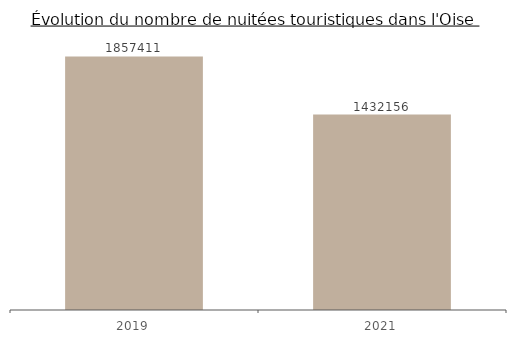
| Category | nombre de nuitées |
|---|---|
| 2019.0 | 1857411 |
| 2021.0 | 1432156 |